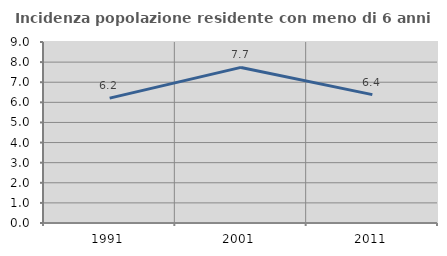
| Category | Incidenza popolazione residente con meno di 6 anni |
|---|---|
| 1991.0 | 6.209 |
| 2001.0 | 7.737 |
| 2011.0 | 6.384 |